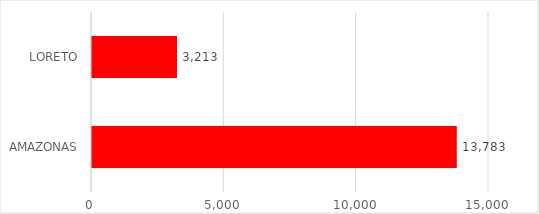
| Category | Series 0 |
|---|---|
| AMAZONAS | 13783 |
| LORETO | 3213 |